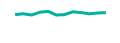
| Category | Series 1 |
|---|---|
| 0 | 31 |
| 1 | 33 |
| 2 | 30 |
| 3 | 37 |
| 4 | 39 |
| 5 | 30 |
| 6 | 31 |
| 7 | 38 |
| 8 | 36 |
| 9 | 33 |
| 10 | 35 |
| 11 | 36 |